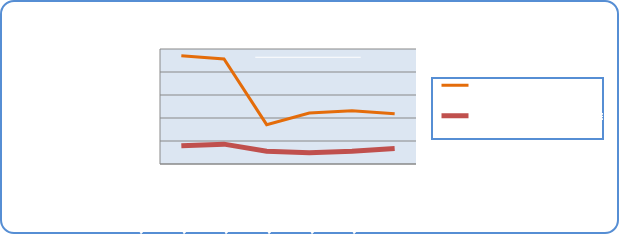
| Category | Motorin Türleri | Benzin Türleri |
|---|---|---|
| 12/30/19 | 47087833.334 | 7898507.109 |
| 12/31/19 | 45679195.721 | 8629747.493 |
| 1/1/20 | 17098221.665 | 5517909.795 |
| 1/2/20 | 22142986.518 | 4859864.237 |
| 1/3/20 | 23109070.847 | 5518705.549 |
| 1/4/20 | 21845868.192 | 6712223.096 |